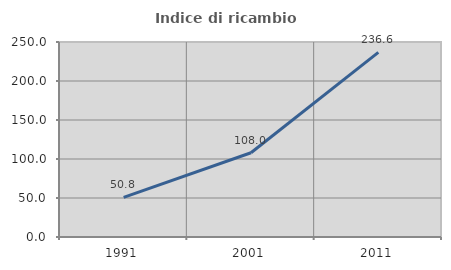
| Category | Indice di ricambio occupazionale  |
|---|---|
| 1991.0 | 50.816 |
| 2001.0 | 107.962 |
| 2011.0 | 236.638 |